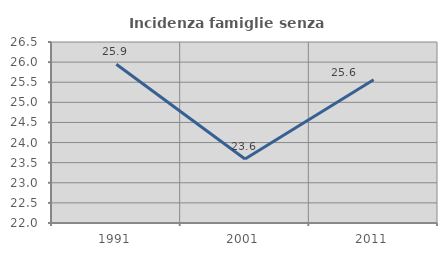
| Category | Incidenza famiglie senza nuclei |
|---|---|
| 1991.0 | 25.948 |
| 2001.0 | 23.59 |
| 2011.0 | 25.56 |